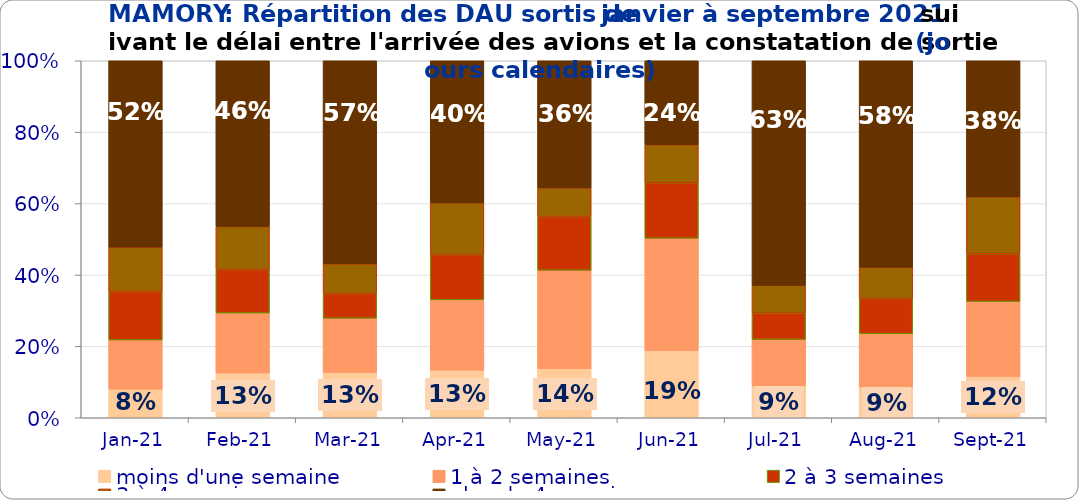
| Category | moins d'une semaine | 1 à 2 semaines | 2 à 3 semaines | 3 à 4 semaines | plus de 4 semaines |
|---|---|---|---|---|---|
| 2021-01-01 | 0.08 | 0.138 | 0.136 | 0.124 | 0.522 |
| 2021-02-01 | 0.125 | 0.168 | 0.122 | 0.121 | 0.464 |
| 2021-03-01 | 0.127 | 0.152 | 0.069 | 0.083 | 0.569 |
| 2021-04-01 | 0.133 | 0.197 | 0.127 | 0.145 | 0.398 |
| 2021-05-01 | 0.137 | 0.276 | 0.15 | 0.08 | 0.356 |
| 2021-06-01 | 0.188 | 0.315 | 0.155 | 0.106 | 0.235 |
| 2021-07-01 | 0.089 | 0.131 | 0.073 | 0.078 | 0.629 |
| 2021-08-01 | 0.086 | 0.149 | 0.099 | 0.088 | 0.578 |
| 2021-09-01 | 0.116 | 0.21 | 0.134 | 0.159 | 0.382 |